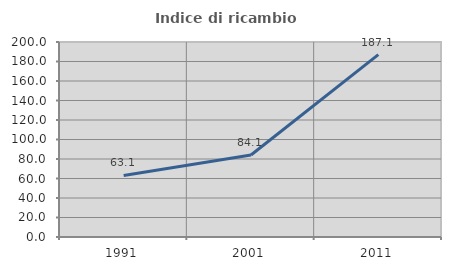
| Category | Indice di ricambio occupazionale  |
|---|---|
| 1991.0 | 63.147 |
| 2001.0 | 84.112 |
| 2011.0 | 187.085 |